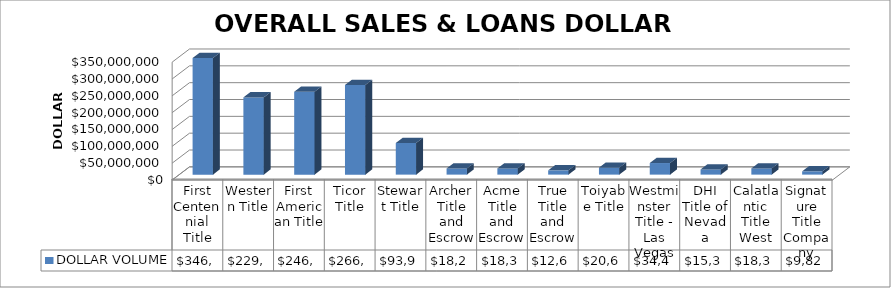
| Category | DOLLAR VOLUME |
|---|---|
| First Centennial Title | 346306801 |
| Western Title | 229425146 |
| First American Title | 246153418.03 |
| Ticor Title | 266292670 |
| Stewart Title | 93916220 |
| Archer Title and Escrow | 18280542 |
| Acme Title and Escrow | 18398408 |
| True Title and Escrow | 12678988 |
| Toiyabe Title | 20690695 |
| Westminster Title - Las Vegas | 34449098 |
| DHI Title of Nevada | 15389690 |
| Calatlantic Title West | 18389717 |
| Signature Title Company | 9822598 |